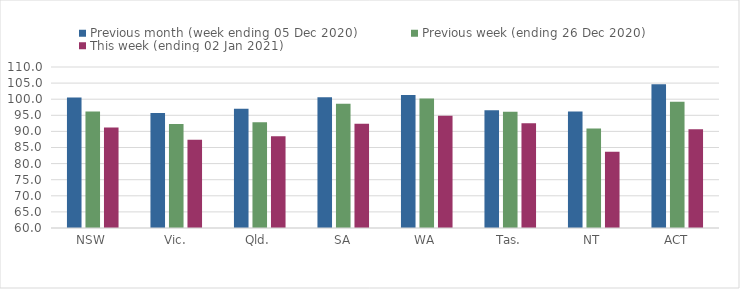
| Category | Previous month (week ending 05 Dec 2020) | Previous week (ending 26 Dec 2020) | This week (ending 02 Jan 2021) |
|---|---|---|---|
| NSW | 100.53 | 96.19 | 91.18 |
| Vic. | 95.72 | 92.31 | 87.37 |
| Qld. | 97.02 | 92.85 | 88.52 |
| SA | 100.57 | 98.58 | 92.41 |
| WA | 101.28 | 100.24 | 94.86 |
| Tas. | 96.55 | 96.1 | 92.55 |
| NT | 96.19 | 90.88 | 83.67 |
| ACT | 104.65 | 99.24 | 90.69 |